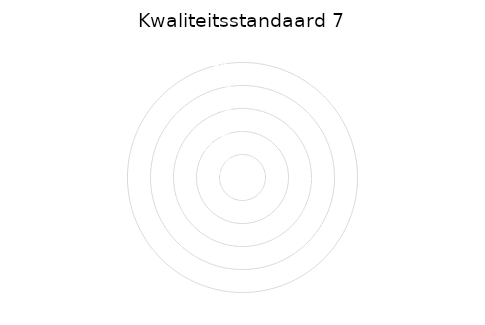
| Category | 7a | 7b | 7d | 7e |
|---|---|---|---|---|
| 0.0 | 0 | 0 | 0 | 0 |
| 1.0 | 0 | 0 | 0 | 0 |
| 2.0 | 0 | 0 | 0 | 0 |
| 3.0 | 0 | 0 | 0 | 0 |
| 4.0 | 0 | 0 | 0 | 0 |
| 5.0 | 0 | 0 | 0 | 0 |
| 6.0 | 0 | 0 | 0 | 0 |
| 7.0 | 0 | 0 | 0 | 0 |
| 8.0 | 0 | 0 | 0 | 0 |
| 9.0 | 0 | 0 | 0 | 0 |
| 10.0 | 0 | 0 | 0 | 0 |
| 11.0 | 0 | 0 | 0 | 0 |
| 12.0 | 0 | 0 | 0 | 0 |
| 13.0 | 0 | 0 | 0 | 0 |
| 14.0 | 0 | 0 | 0 | 0 |
| 15.0 | 0 | 0 | 0 | 0 |
| 16.0 | 0 | 0 | 0 | 0 |
| 17.0 | 0 | 0 | 0 | 0 |
| 18.0 | 0 | 0 | 0 | 0 |
| 19.0 | 0 | 0 | 0 | 0 |
| 20.0 | 0 | 0 | 0 | 0 |
| 21.0 | 0 | 0 | 0 | 0 |
| 22.0 | 0 | 0 | 0 | 0 |
| 23.0 | 0 | 0 | 0 | 0 |
| 24.0 | 0 | 0 | 0 | 0 |
| 25.0 | 0 | 0 | 0 | 0 |
| 26.0 | 0 | 0 | 0 | 0 |
| 27.0 | 0 | 0 | 0 | 0 |
| 28.0 | 0 | 0 | 0 | 0 |
| 29.0 | 0 | 0 | 0 | 0 |
| 30.0 | 0 | 0 | 0 | 0 |
| 31.0 | 0 | 0 | 0 | 0 |
| 32.0 | 0 | 0 | 0 | 0 |
| 33.0 | 0 | 0 | 0 | 0 |
| 34.0 | 0 | 0 | 0 | 0 |
| 35.0 | 0 | 0 | 0 | 0 |
| 36.0 | 0 | 0 | 0 | 0 |
| 37.0 | 0 | 0 | 0 | 0 |
| 38.0 | 0 | 0 | 0 | 0 |
| 39.0 | 0 | 0 | 0 | 0 |
| 40.0 | 0 | 0 | 0 | 0 |
| 41.0 | 0 | 0 | 0 | 0 |
| 42.0 | 0 | 0 | 0 | 0 |
| 43.0 | 0 | 0 | 0 | 0 |
| 44.0 | 0 | 0 | 0 | 0 |
| 45.0 | 0 | 0 | 0 | 0 |
| 46.0 | 0 | 0 | 0 | 0 |
| 47.0 | 0 | 0 | 0 | 0 |
| 48.0 | 0 | 0 | 0 | 0 |
| 49.0 | 0 | 0 | 0 | 0 |
| 50.0 | 0 | 0 | 0 | 0 |
| 51.0 | 0 | 0 | 0 | 0 |
| 52.0 | 0 | 0 | 0 | 0 |
| 53.0 | 0 | 0 | 0 | 0 |
| 54.0 | 0 | 0 | 0 | 0 |
| 55.0 | 0 | 0 | 0 | 0 |
| 56.0 | 0 | 0 | 0 | 0 |
| 57.0 | 0 | 0 | 0 | 0 |
| 58.0 | 0 | 0 | 0 | 0 |
| 59.0 | 0 | 0 | 0 | 0 |
| 60.0 | 0 | 0 | 0 | 0 |
| 61.0 | 0 | 0 | 0 | 0 |
| 62.0 | 0 | 0 | 0 | 0 |
| 63.0 | 0 | 0 | 0 | 0 |
| 64.0 | 0 | 0 | 0 | 0 |
| 65.0 | 0 | 0 | 0 | 0 |
| 66.0 | 0 | 0 | 0 | 0 |
| 67.0 | 0 | 0 | 0 | 0 |
| 68.0 | 0 | 0 | 0 | 0 |
| 69.0 | 0 | 0 | 0 | 0 |
| 70.0 | 0 | 0 | 0 | 0 |
| 71.0 | 0 | 0 | 0 | 0 |
| 72.0 | 0 | 0 | 0 | 0 |
| 73.0 | 0 | 0 | 0 | 0 |
| 74.0 | 0 | 0 | 0 | 0 |
| 75.0 | 0 | 0 | 0 | 0 |
| 76.0 | 0 | 0 | 0 | 0 |
| 77.0 | 0 | 0 | 0 | 0 |
| 78.0 | 0 | 0 | 0 | 0 |
| 79.0 | 0 | 0 | 0 | 0 |
| 80.0 | 0 | 0 | 0 | 0 |
| 81.0 | 0 | 0 | 0 | 0 |
| 82.0 | 0 | 0 | 0 | 0 |
| 83.0 | 0 | 0 | 0 | 0 |
| 84.0 | 0 | 0 | 0 | 0 |
| 85.0 | 0 | 0 | 0 | 0 |
| 86.0 | 0 | 0 | 0 | 0 |
| 87.0 | 0 | 0 | 0 | 0 |
| 88.0 | 0 | 0 | 0 | 0 |
| 89.0 | 0 | 0 | 0 | 0 |
| 90.0 | 0 | 0 | 0 | 0 |
| 91.0 | 0 | 0 | 0 | 0 |
| 92.0 | 0 | 0 | 0 | 0 |
| 93.0 | 0 | 0 | 0 | 0 |
| 94.0 | 0 | 0 | 0 | 0 |
| 95.0 | 0 | 0 | 0 | 0 |
| 96.0 | 0 | 0 | 0 | 0 |
| 97.0 | 0 | 0 | 0 | 0 |
| 98.0 | 0 | 0 | 0 | 0 |
| 99.0 | 0 | 0 | 0 | 0 |
| 100.0 | 0 | 0 | 0 | 0 |
| 101.0 | 0 | 0 | 0 | 0 |
| 102.0 | 0 | 0 | 0 | 0 |
| 103.0 | 0 | 0 | 0 | 0 |
| 104.0 | 0 | 0 | 0 | 0 |
| 105.0 | 0 | 0 | 0 | 0 |
| 106.0 | 0 | 0 | 0 | 0 |
| 107.0 | 0 | 0 | 0 | 0 |
| 108.0 | 0 | 0 | 0 | 0 |
| 109.0 | 0 | 0 | 0 | 0 |
| 110.0 | 0 | 0 | 0 | 0 |
| 111.0 | 0 | 0 | 0 | 0 |
| 112.0 | 0 | 0 | 0 | 0 |
| 113.0 | 0 | 0 | 0 | 0 |
| 114.0 | 0 | 0 | 0 | 0 |
| 115.0 | 0 | 0 | 0 | 0 |
| 116.0 | 0 | 0 | 0 | 0 |
| 117.0 | 0 | 0 | 0 | 0 |
| 118.0 | 0 | 0 | 0 | 0 |
| 119.0 | 0 | 0 | 0 | 0 |
| 120.0 | 0 | 0 | 0 | 0 |
| 121.0 | 0 | 0 | 0 | 0 |
| 122.0 | 0 | 0 | 0 | 0 |
| 123.0 | 0 | 0 | 0 | 0 |
| 124.0 | 0 | 0 | 0 | 0 |
| 125.0 | 0 | 0 | 0 | 0 |
| 126.0 | 0 | 0 | 0 | 0 |
| 127.0 | 0 | 0 | 0 | 0 |
| 128.0 | 0 | 0 | 0 | 0 |
| 129.0 | 0 | 0 | 0 | 0 |
| 130.0 | 0 | 0 | 0 | 0 |
| 131.0 | 0 | 0 | 0 | 0 |
| 132.0 | 0 | 0 | 0 | 0 |
| 133.0 | 0 | 0 | 0 | 0 |
| 134.0 | 0 | 0 | 0 | 0 |
| 135.0 | 0 | 0 | 0 | 0 |
| 136.0 | 0 | 0 | 0 | 0 |
| 137.0 | 0 | 0 | 0 | 0 |
| 138.0 | 0 | 0 | 0 | 0 |
| 139.0 | 0 | 0 | 0 | 0 |
| 140.0 | 0 | 0 | 0 | 0 |
| 141.0 | 0 | 0 | 0 | 0 |
| 142.0 | 0 | 0 | 0 | 0 |
| 143.0 | 0 | 0 | 0 | 0 |
| 144.0 | 0 | 0 | 0 | 0 |
| 145.0 | 0 | 0 | 0 | 0 |
| 146.0 | 0 | 0 | 0 | 0 |
| 147.0 | 0 | 0 | 0 | 0 |
| 148.0 | 0 | 0 | 0 | 0 |
| 149.0 | 0 | 0 | 0 | 0 |
| 150.0 | 0 | 0 | 0 | 0 |
| 151.0 | 0 | 0 | 0 | 0 |
| 152.0 | 0 | 0 | 0 | 0 |
| 153.0 | 0 | 0 | 0 | 0 |
| 154.0 | 0 | 0 | 0 | 0 |
| 155.0 | 0 | 0 | 0 | 0 |
| 156.0 | 0 | 0 | 0 | 0 |
| 157.0 | 0 | 0 | 0 | 0 |
| 158.0 | 0 | 0 | 0 | 0 |
| 159.0 | 0 | 0 | 0 | 0 |
| 160.0 | 0 | 0 | 0 | 0 |
| 161.0 | 0 | 0 | 0 | 0 |
| 162.0 | 0 | 0 | 0 | 0 |
| 163.0 | 0 | 0 | 0 | 0 |
| 164.0 | 0 | 0 | 0 | 0 |
| 165.0 | 0 | 0 | 0 | 0 |
| 166.0 | 0 | 0 | 0 | 0 |
| 167.0 | 0 | 0 | 0 | 0 |
| 168.0 | 0 | 0 | 0 | 0 |
| 169.0 | 0 | 0 | 0 | 0 |
| 170.0 | 0 | 0 | 0 | 0 |
| 171.0 | 0 | 0 | 0 | 0 |
| 172.0 | 0 | 0 | 0 | 0 |
| 173.0 | 0 | 0 | 0 | 0 |
| 174.0 | 0 | 0 | 0 | 0 |
| 175.0 | 0 | 0 | 0 | 0 |
| 176.0 | 0 | 0 | 0 | 0 |
| 177.0 | 0 | 0 | 0 | 0 |
| 178.0 | 0 | 0 | 0 | 0 |
| 179.0 | 0 | 0 | 0 | 0 |
| 180.0 | 0 | 0 | 0 | 0 |
| 181.0 | 0 | 0 | 0 | 0 |
| 182.0 | 0 | 0 | 0 | 0 |
| 183.0 | 0 | 0 | 0 | 0 |
| 184.0 | 0 | 0 | 0 | 0 |
| 185.0 | 0 | 0 | 0 | 0 |
| 186.0 | 0 | 0 | 0 | 0 |
| 187.0 | 0 | 0 | 0 | 0 |
| 188.0 | 0 | 0 | 0 | 0 |
| 189.0 | 0 | 0 | 0 | 0 |
| 190.0 | 0 | 0 | 0 | 0 |
| 191.0 | 0 | 0 | 0 | 0 |
| 192.0 | 0 | 0 | 0 | 0 |
| 193.0 | 0 | 0 | 0 | 0 |
| 194.0 | 0 | 0 | 0 | 0 |
| 195.0 | 0 | 0 | 0 | 0 |
| 196.0 | 0 | 0 | 0 | 0 |
| 197.0 | 0 | 0 | 0 | 0 |
| 198.0 | 0 | 0 | 0 | 0 |
| 199.0 | 0 | 0 | 0 | 0 |
| 200.0 | 0 | 0 | 0 | 0 |
| 201.0 | 0 | 0 | 0 | 0 |
| 202.0 | 0 | 0 | 0 | 0 |
| 203.0 | 0 | 0 | 0 | 0 |
| 204.0 | 0 | 0 | 0 | 0 |
| 205.0 | 0 | 0 | 0 | 0 |
| 206.0 | 0 | 0 | 0 | 0 |
| 207.0 | 0 | 0 | 0 | 0 |
| 208.0 | 0 | 0 | 0 | 0 |
| 209.0 | 0 | 0 | 0 | 0 |
| 210.0 | 0 | 0 | 0 | 0 |
| 211.0 | 0 | 0 | 0 | 0 |
| 212.0 | 0 | 0 | 0 | 0 |
| 213.0 | 0 | 0 | 0 | 0 |
| 214.0 | 0 | 0 | 0 | 0 |
| 215.0 | 0 | 0 | 0 | 0 |
| 216.0 | 0 | 0 | 0 | 0 |
| 217.0 | 0 | 0 | 0 | 0 |
| 218.0 | 0 | 0 | 0 | 0 |
| 219.0 | 0 | 0 | 0 | 0 |
| 220.0 | 0 | 0 | 0 | 0 |
| 221.0 | 0 | 0 | 0 | 0 |
| 222.0 | 0 | 0 | 0 | 0 |
| 223.0 | 0 | 0 | 0 | 0 |
| 224.0 | 0 | 0 | 0 | 0 |
| 225.0 | 0 | 0 | 0 | 0 |
| 226.0 | 0 | 0 | 0 | 0 |
| 227.0 | 0 | 0 | 0 | 0 |
| 228.0 | 0 | 0 | 0 | 0 |
| 229.0 | 0 | 0 | 0 | 0 |
| 230.0 | 0 | 0 | 0 | 0 |
| 231.0 | 0 | 0 | 0 | 0 |
| 232.0 | 0 | 0 | 0 | 0 |
| 233.0 | 0 | 0 | 0 | 0 |
| 234.0 | 0 | 0 | 0 | 0 |
| 235.0 | 0 | 0 | 0 | 0 |
| 236.0 | 0 | 0 | 0 | 0 |
| 237.0 | 0 | 0 | 0 | 0 |
| 238.0 | 0 | 0 | 0 | 0 |
| 239.0 | 0 | 0 | 0 | 0 |
| 240.0 | 0 | 0 | 0 | 0 |
| 241.0 | 0 | 0 | 0 | 0 |
| 242.0 | 0 | 0 | 0 | 0 |
| 243.0 | 0 | 0 | 0 | 0 |
| 244.0 | 0 | 0 | 0 | 0 |
| 245.0 | 0 | 0 | 0 | 0 |
| 246.0 | 0 | 0 | 0 | 0 |
| 247.0 | 0 | 0 | 0 | 0 |
| 248.0 | 0 | 0 | 0 | 0 |
| 249.0 | 0 | 0 | 0 | 0 |
| 250.0 | 0 | 0 | 0 | 0 |
| 251.0 | 0 | 0 | 0 | 0 |
| 252.0 | 0 | 0 | 0 | 0 |
| 253.0 | 0 | 0 | 0 | 0 |
| 254.0 | 0 | 0 | 0 | 0 |
| 255.0 | 0 | 0 | 0 | 0 |
| 256.0 | 0 | 0 | 0 | 0 |
| 257.0 | 0 | 0 | 0 | 0 |
| 258.0 | 0 | 0 | 0 | 0 |
| 259.0 | 0 | 0 | 0 | 0 |
| 260.0 | 0 | 0 | 0 | 0 |
| 261.0 | 0 | 0 | 0 | 0 |
| 262.0 | 0 | 0 | 0 | 0 |
| 263.0 | 0 | 0 | 0 | 0 |
| 264.0 | 0 | 0 | 0 | 0 |
| 265.0 | 0 | 0 | 0 | 0 |
| 266.0 | 0 | 0 | 0 | 0 |
| 267.0 | 0 | 0 | 0 | 0 |
| 268.0 | 0 | 0 | 0 | 0 |
| 269.0 | 0 | 0 | 0 | 0 |
| 270.0 | 0 | 0 | 0 | 0 |
| 271.0 | 0 | 0 | 0 | 0 |
| 272.0 | 0 | 0 | 0 | 0 |
| 273.0 | 0 | 0 | 0 | 0 |
| 274.0 | 0 | 0 | 0 | 0 |
| 275.0 | 0 | 0 | 0 | 0 |
| 276.0 | 0 | 0 | 0 | 0 |
| 277.0 | 0 | 0 | 0 | 0 |
| 278.0 | 0 | 0 | 0 | 0 |
| 279.0 | 0 | 0 | 0 | 0 |
| 280.0 | 0 | 0 | 0 | 0 |
| 281.0 | 0 | 0 | 0 | 0 |
| 282.0 | 0 | 0 | 0 | 0 |
| 283.0 | 0 | 0 | 0 | 0 |
| 284.0 | 0 | 0 | 0 | 0 |
| 285.0 | 0 | 0 | 0 | 0 |
| 286.0 | 0 | 0 | 0 | 0 |
| 287.0 | 0 | 0 | 0 | 0 |
| 288.0 | 0 | 0 | 0 | 0 |
| 289.0 | 0 | 0 | 0 | 0 |
| 290.0 | 0 | 0 | 0 | 0 |
| 291.0 | 0 | 0 | 0 | 0 |
| 292.0 | 0 | 0 | 0 | 0 |
| 293.0 | 0 | 0 | 0 | 0 |
| 294.0 | 0 | 0 | 0 | 0 |
| 295.0 | 0 | 0 | 0 | 0 |
| 296.0 | 0 | 0 | 0 | 0 |
| 297.0 | 0 | 0 | 0 | 0 |
| 298.0 | 0 | 0 | 0 | 0 |
| 299.0 | 0 | 0 | 0 | 0 |
| 300.0 | 0 | 0 | 0 | 0 |
| 301.0 | 0 | 0 | 0 | 0 |
| 302.0 | 0 | 0 | 0 | 0 |
| 303.0 | 0 | 0 | 0 | 0 |
| 304.0 | 0 | 0 | 0 | 0 |
| 305.0 | 0 | 0 | 0 | 0 |
| 306.0 | 0 | 0 | 0 | 0 |
| 307.0 | 0 | 0 | 0 | 0 |
| 308.0 | 0 | 0 | 0 | 0 |
| 309.0 | 0 | 0 | 0 | 0 |
| 310.0 | 0 | 0 | 0 | 0 |
| 311.0 | 0 | 0 | 0 | 0 |
| 312.0 | 0 | 0 | 0 | 0 |
| 313.0 | 0 | 0 | 0 | 0 |
| 314.0 | 0 | 0 | 0 | 0 |
| 315.0 | 0 | 0 | 0 | 0 |
| 316.0 | 0 | 0 | 0 | 0 |
| 317.0 | 0 | 0 | 0 | 0 |
| 318.0 | 0 | 0 | 0 | 0 |
| 319.0 | 0 | 0 | 0 | 0 |
| 320.0 | 0 | 0 | 0 | 0 |
| 321.0 | 0 | 0 | 0 | 0 |
| 322.0 | 0 | 0 | 0 | 0 |
| 323.0 | 0 | 0 | 0 | 0 |
| 324.0 | 0 | 0 | 0 | 0 |
| 325.0 | 0 | 0 | 0 | 0 |
| 326.0 | 0 | 0 | 0 | 0 |
| 327.0 | 0 | 0 | 0 | 0 |
| 328.0 | 0 | 0 | 0 | 0 |
| 329.0 | 0 | 0 | 0 | 0 |
| 330.0 | 0 | 0 | 0 | 0 |
| 331.0 | 0 | 0 | 0 | 0 |
| 332.0 | 0 | 0 | 0 | 0 |
| 333.0 | 0 | 0 | 0 | 0 |
| 334.0 | 0 | 0 | 0 | 0 |
| 335.0 | 0 | 0 | 0 | 0 |
| 336.0 | 0 | 0 | 0 | 0 |
| 337.0 | 0 | 0 | 0 | 0 |
| 338.0 | 0 | 0 | 0 | 0 |
| 339.0 | 0 | 0 | 0 | 0 |
| 340.0 | 0 | 0 | 0 | 0 |
| 341.0 | 0 | 0 | 0 | 0 |
| 342.0 | 0 | 0 | 0 | 0 |
| 343.0 | 0 | 0 | 0 | 0 |
| 344.0 | 0 | 0 | 0 | 0 |
| 345.0 | 0 | 0 | 0 | 0 |
| 346.0 | 0 | 0 | 0 | 0 |
| 347.0 | 0 | 0 | 0 | 0 |
| 348.0 | 0 | 0 | 0 | 0 |
| 349.0 | 0 | 0 | 0 | 0 |
| 350.0 | 0 | 0 | 0 | 0 |
| 351.0 | 0 | 0 | 0 | 0 |
| 352.0 | 0 | 0 | 0 | 0 |
| 353.0 | 0 | 0 | 0 | 0 |
| 354.0 | 0 | 0 | 0 | 0 |
| 355.0 | 0 | 0 | 0 | 0 |
| 356.0 | 0 | 0 | 0 | 0 |
| 357.0 | 0 | 0 | 0 | 0 |
| 358.0 | 0 | 0 | 0 | 0 |
| 359.0 | 0 | 0 | 0 | 0 |
| 360.0 | 0 | 0 | 0 | 0 |